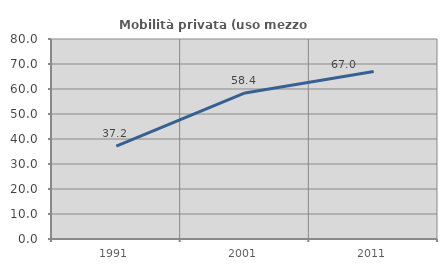
| Category | Mobilità privata (uso mezzo privato) |
|---|---|
| 1991.0 | 37.171 |
| 2001.0 | 58.434 |
| 2011.0 | 66.979 |